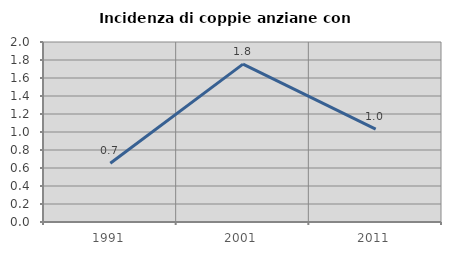
| Category | Incidenza di coppie anziane con figli |
|---|---|
| 1991.0 | 0.654 |
| 2001.0 | 1.754 |
| 2011.0 | 1.031 |